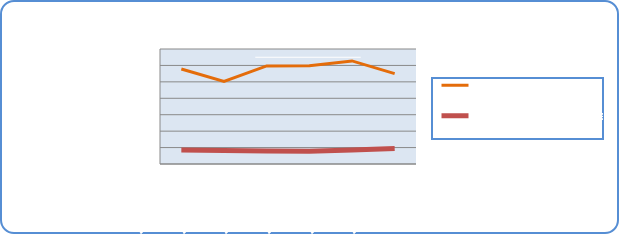
| Category | Motorin Türleri | Benzin Türleri |
|---|---|---|
| 10/28/19 | 57816142.444 | 8495993.761 |
| 10/29/19 | 50313820.539 | 8250343.417 |
| 10/30/19 | 59722544.128 | 7892265.15 |
| 10/31/19 | 59785155.877 | 7793074.919 |
| 11/1/19 | 62747556.723 | 8498585.461 |
| 11/2/19 | 55008478.19 | 9423414.965 |